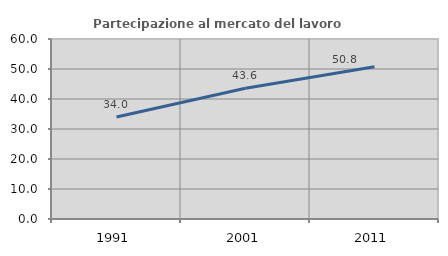
| Category | Partecipazione al mercato del lavoro  femminile |
|---|---|
| 1991.0 | 34.014 |
| 2001.0 | 43.571 |
| 2011.0 | 50.758 |